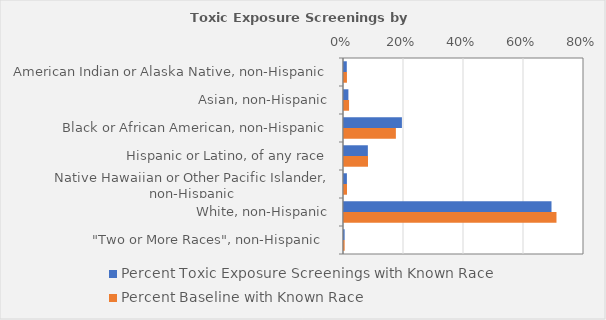
| Category | Percent Toxic Exposure Screenings with Known Race | Percent Baseline with Known Race |
|---|---|---|
| American Indian or Alaska Native, non-Hispanic | 0.009 | 0.01 |
| Asian, non-Hispanic | 0.015 | 0.017 |
| Black or African American, non-Hispanic | 0.193 | 0.173 |
| Hispanic or Latino, of any race | 0.08 | 0.08 |
| Native Hawaiian or Other Pacific Islander, non-Hispanic | 0.01 | 0.01 |
| White, non-Hispanic | 0.692 | 0.708 |
| "Two or More Races", non-Hispanic  | 0.002 | 0.002 |